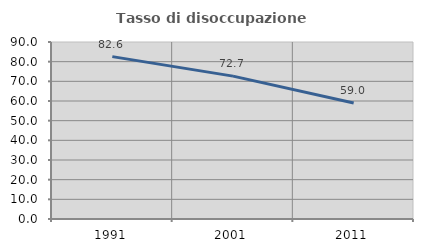
| Category | Tasso di disoccupazione giovanile  |
|---|---|
| 1991.0 | 82.567 |
| 2001.0 | 72.653 |
| 2011.0 | 58.979 |